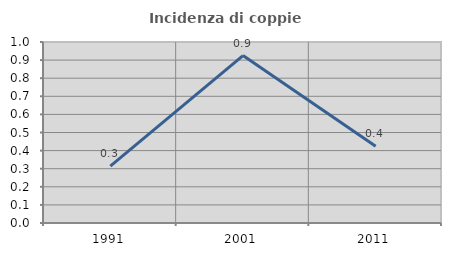
| Category | Incidenza di coppie miste |
|---|---|
| 1991.0 | 0.314 |
| 2001.0 | 0.925 |
| 2011.0 | 0.423 |